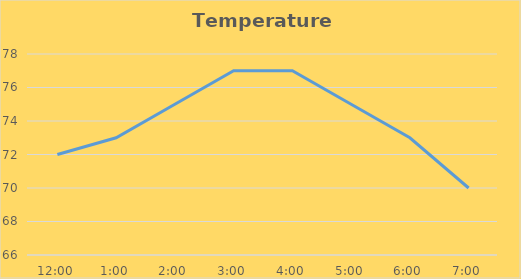
| Category | Temperature (deg)F |
|---|---|
| 0.5 | 72 |
| 0.041666666666666664 | 73 |
| 0.08333333333333333 | 75 |
| 0.125 | 77 |
| 0.16666666666666666 | 77 |
| 0.20833333333333334 | 75 |
| 0.25 | 73 |
| 0.2916666666666667 | 70 |